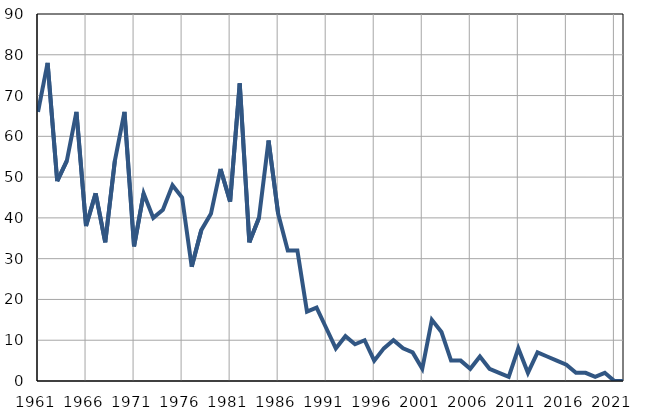
| Category | Infants
deaths |
|---|---|
| 1961.0 | 66 |
| 1962.0 | 78 |
| 1963.0 | 49 |
| 1964.0 | 54 |
| 1965.0 | 66 |
| 1966.0 | 38 |
| 1967.0 | 46 |
| 1968.0 | 34 |
| 1969.0 | 54 |
| 1970.0 | 66 |
| 1971.0 | 33 |
| 1972.0 | 46 |
| 1973.0 | 40 |
| 1974.0 | 42 |
| 1975.0 | 48 |
| 1976.0 | 45 |
| 1977.0 | 28 |
| 1978.0 | 37 |
| 1979.0 | 41 |
| 1980.0 | 52 |
| 1981.0 | 44 |
| 1982.0 | 73 |
| 1983.0 | 34 |
| 1984.0 | 40 |
| 1985.0 | 59 |
| 1986.0 | 41 |
| 1987.0 | 32 |
| 1988.0 | 32 |
| 1989.0 | 17 |
| 1990.0 | 18 |
| 1991.0 | 13 |
| 1992.0 | 8 |
| 1993.0 | 11 |
| 1994.0 | 9 |
| 1995.0 | 10 |
| 1996.0 | 5 |
| 1997.0 | 8 |
| 1998.0 | 10 |
| 1999.0 | 8 |
| 2000.0 | 7 |
| 2001.0 | 3 |
| 2002.0 | 15 |
| 2003.0 | 12 |
| 2004.0 | 5 |
| 2005.0 | 5 |
| 2006.0 | 3 |
| 2007.0 | 6 |
| 2008.0 | 3 |
| 2009.0 | 2 |
| 2010.0 | 1 |
| 2011.0 | 8 |
| 2012.0 | 2 |
| 2013.0 | 7 |
| 2014.0 | 6 |
| 2015.0 | 5 |
| 2016.0 | 4 |
| 2017.0 | 2 |
| 2018.0 | 2 |
| 2019.0 | 1 |
| 2020.0 | 2 |
| 2021.0 | 0 |
| 2022.0 | 0 |